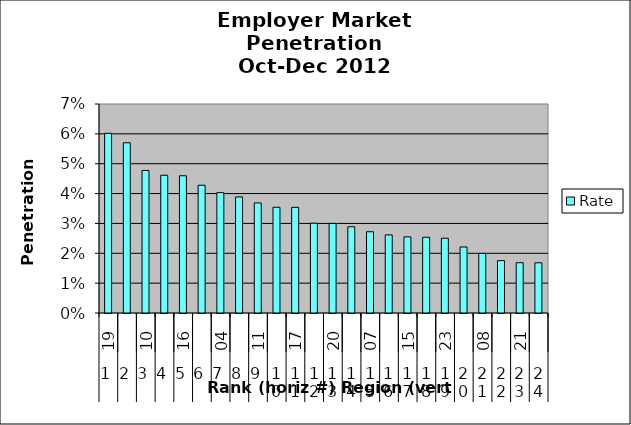
| Category | Rate |
|---|---|
| 0 | 0.06 |
| 1 | 0.057 |
| 2 | 0.048 |
| 3 | 0.046 |
| 4 | 0.046 |
| 5 | 0.043 |
| 6 | 0.04 |
| 7 | 0.039 |
| 8 | 0.037 |
| 9 | 0.035 |
| 10 | 0.035 |
| 11 | 0.03 |
| 12 | 0.03 |
| 13 | 0.029 |
| 14 | 0.027 |
| 15 | 0.026 |
| 16 | 0.025 |
| 17 | 0.025 |
| 18 | 0.025 |
| 19 | 0.022 |
| 20 | 0.02 |
| 21 | 0.018 |
| 22 | 0.017 |
| 23 | 0.017 |